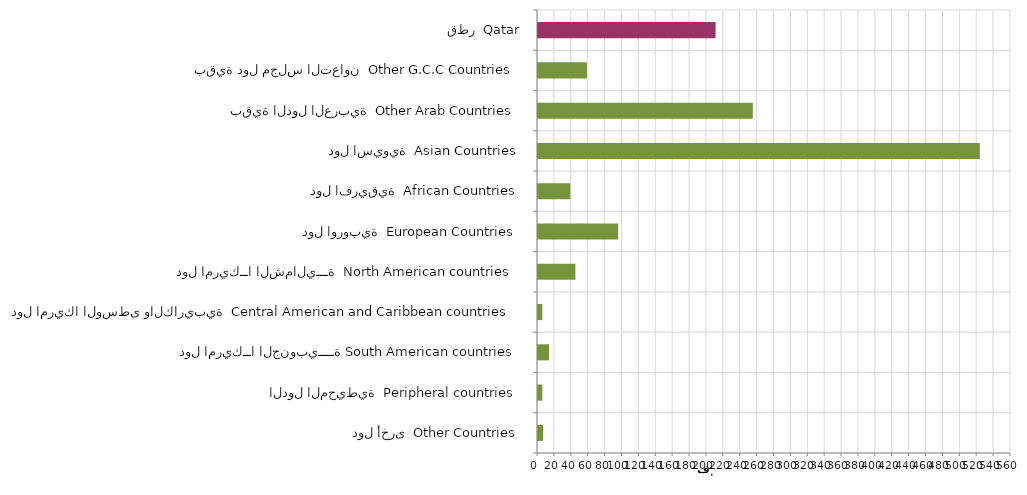
| Category | Series 0 |
|---|---|
| دول أخرى  Other Countries | 5917 |
| الدول المحيطية  Peripheral countries | 5126 |
| دول امريكــا الجنوبيــــة South American countries | 13037 |
| دول امريكا الوسطى والكاريبية  Central American and Caribbean countries | 5116 |
| دول امريكــا الشماليـــة  North American countries  | 44285 |
| دول اوروبية  European Countries | 94904 |
| دول افريقية  African Countries | 38283 |
| دول اسيوية  Asian Countries | 523068 |
| بقية الدول العربية  Other Arab Countries | 254298 |
| بقية دول مجلس التعاون  Other G.C.C Countries | 57888 |
| قطر  Qatar | 210229 |